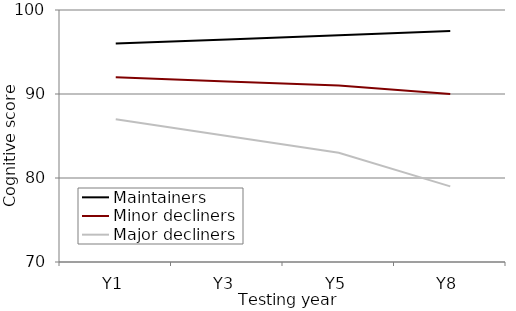
| Category | Maintainers | Minor decliners | Major decliners |
|---|---|---|---|
| Y1 | 96 | 92 | 87 |
| Y3 | 96.5 | 91.5 | 85 |
| Y5 | 97 | 91 | 83 |
| Y8 | 97.5 | 90 | 79 |